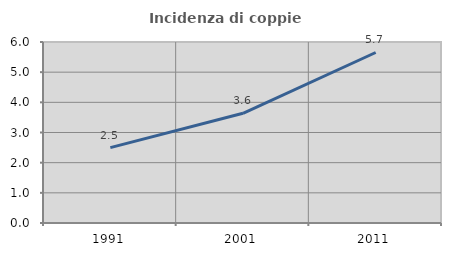
| Category | Incidenza di coppie miste |
|---|---|
| 1991.0 | 2.5 |
| 2001.0 | 3.636 |
| 2011.0 | 5.652 |